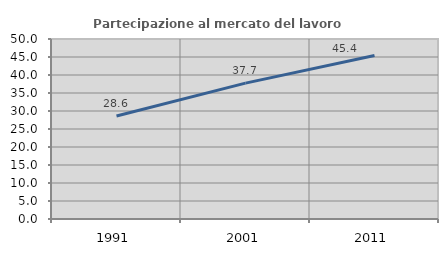
| Category | Partecipazione al mercato del lavoro  femminile |
|---|---|
| 1991.0 | 28.618 |
| 2001.0 | 37.741 |
| 2011.0 | 45.423 |